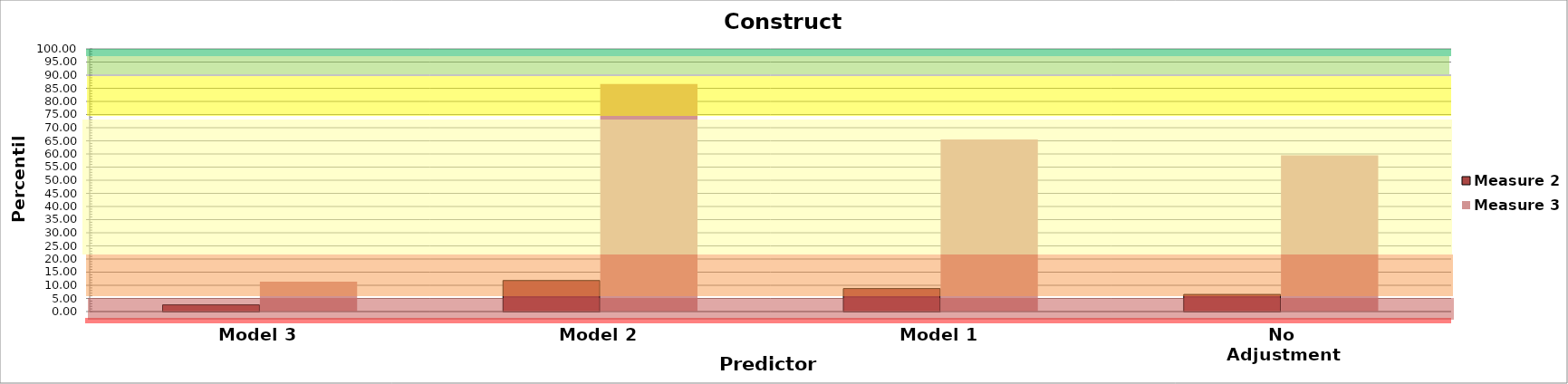
| Category | Measure 2 | Measure 3 |
|---|---|---|
| 0 | 2.539 | 11.378 |
| 1 | 11.815 | 86.66 |
| 2 | 8.75 | 65.488 |
| 3 | 6.516 | 59.483 |